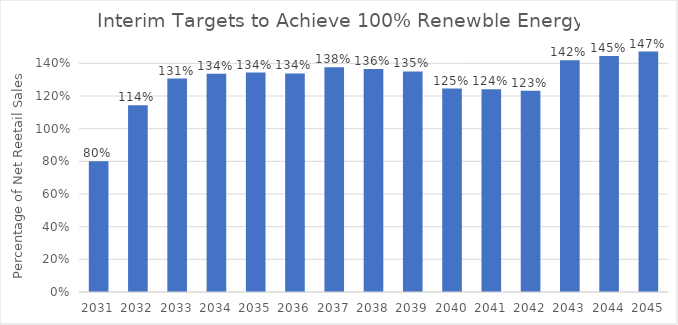
| Category | Percentage Clean Energy |
|---|---|
| 2031.0 | 0.801 |
| 2032.0 | 1.143 |
| 2033.0 | 1.306 |
| 2034.0 | 1.336 |
| 2035.0 | 1.343 |
| 2036.0 | 1.338 |
| 2037.0 | 1.375 |
| 2038.0 | 1.365 |
| 2039.0 | 1.351 |
| 2040.0 | 1.246 |
| 2041.0 | 1.241 |
| 2042.0 | 1.232 |
| 2043.0 | 1.418 |
| 2044.0 | 1.445 |
| 2045.0 | 1.472 |